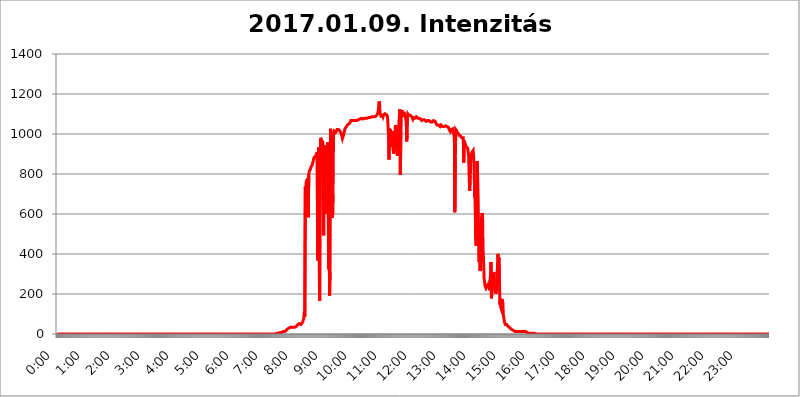
| Category | 2017.01.09. Intenzitás [W/m^2] |
|---|---|
| 0.0 | 0 |
| 0.0006944444444444445 | 0 |
| 0.001388888888888889 | 0 |
| 0.0020833333333333333 | 0 |
| 0.002777777777777778 | 0 |
| 0.003472222222222222 | 0 |
| 0.004166666666666667 | 0 |
| 0.004861111111111111 | 0 |
| 0.005555555555555556 | 0 |
| 0.0062499999999999995 | 0 |
| 0.006944444444444444 | 0 |
| 0.007638888888888889 | 0 |
| 0.008333333333333333 | 0 |
| 0.009027777777777779 | 0 |
| 0.009722222222222222 | 0 |
| 0.010416666666666666 | 0 |
| 0.011111111111111112 | 0 |
| 0.011805555555555555 | 0 |
| 0.012499999999999999 | 0 |
| 0.013194444444444444 | 0 |
| 0.013888888888888888 | 0 |
| 0.014583333333333332 | 0 |
| 0.015277777777777777 | 0 |
| 0.015972222222222224 | 0 |
| 0.016666666666666666 | 0 |
| 0.017361111111111112 | 0 |
| 0.018055555555555557 | 0 |
| 0.01875 | 0 |
| 0.019444444444444445 | 0 |
| 0.02013888888888889 | 0 |
| 0.020833333333333332 | 0 |
| 0.02152777777777778 | 0 |
| 0.022222222222222223 | 0 |
| 0.02291666666666667 | 0 |
| 0.02361111111111111 | 0 |
| 0.024305555555555556 | 0 |
| 0.024999999999999998 | 0 |
| 0.025694444444444447 | 0 |
| 0.02638888888888889 | 0 |
| 0.027083333333333334 | 0 |
| 0.027777777777777776 | 0 |
| 0.02847222222222222 | 0 |
| 0.029166666666666664 | 0 |
| 0.029861111111111113 | 0 |
| 0.030555555555555555 | 0 |
| 0.03125 | 0 |
| 0.03194444444444445 | 0 |
| 0.03263888888888889 | 0 |
| 0.03333333333333333 | 0 |
| 0.034027777777777775 | 0 |
| 0.034722222222222224 | 0 |
| 0.035416666666666666 | 0 |
| 0.036111111111111115 | 0 |
| 0.03680555555555556 | 0 |
| 0.0375 | 0 |
| 0.03819444444444444 | 0 |
| 0.03888888888888889 | 0 |
| 0.03958333333333333 | 0 |
| 0.04027777777777778 | 0 |
| 0.04097222222222222 | 0 |
| 0.041666666666666664 | 0 |
| 0.042361111111111106 | 0 |
| 0.04305555555555556 | 0 |
| 0.043750000000000004 | 0 |
| 0.044444444444444446 | 0 |
| 0.04513888888888889 | 0 |
| 0.04583333333333334 | 0 |
| 0.04652777777777778 | 0 |
| 0.04722222222222222 | 0 |
| 0.04791666666666666 | 0 |
| 0.04861111111111111 | 0 |
| 0.049305555555555554 | 0 |
| 0.049999999999999996 | 0 |
| 0.05069444444444445 | 0 |
| 0.051388888888888894 | 0 |
| 0.052083333333333336 | 0 |
| 0.05277777777777778 | 0 |
| 0.05347222222222222 | 0 |
| 0.05416666666666667 | 0 |
| 0.05486111111111111 | 0 |
| 0.05555555555555555 | 0 |
| 0.05625 | 0 |
| 0.05694444444444444 | 0 |
| 0.057638888888888885 | 0 |
| 0.05833333333333333 | 0 |
| 0.05902777777777778 | 0 |
| 0.059722222222222225 | 0 |
| 0.06041666666666667 | 0 |
| 0.061111111111111116 | 0 |
| 0.06180555555555556 | 0 |
| 0.0625 | 0 |
| 0.06319444444444444 | 0 |
| 0.06388888888888888 | 0 |
| 0.06458333333333334 | 0 |
| 0.06527777777777778 | 0 |
| 0.06597222222222222 | 0 |
| 0.06666666666666667 | 0 |
| 0.06736111111111111 | 0 |
| 0.06805555555555555 | 0 |
| 0.06874999999999999 | 0 |
| 0.06944444444444443 | 0 |
| 0.07013888888888889 | 0 |
| 0.07083333333333333 | 0 |
| 0.07152777777777779 | 0 |
| 0.07222222222222223 | 0 |
| 0.07291666666666667 | 0 |
| 0.07361111111111111 | 0 |
| 0.07430555555555556 | 0 |
| 0.075 | 0 |
| 0.07569444444444444 | 0 |
| 0.0763888888888889 | 0 |
| 0.07708333333333334 | 0 |
| 0.07777777777777778 | 0 |
| 0.07847222222222222 | 0 |
| 0.07916666666666666 | 0 |
| 0.0798611111111111 | 0 |
| 0.08055555555555556 | 0 |
| 0.08125 | 0 |
| 0.08194444444444444 | 0 |
| 0.08263888888888889 | 0 |
| 0.08333333333333333 | 0 |
| 0.08402777777777777 | 0 |
| 0.08472222222222221 | 0 |
| 0.08541666666666665 | 0 |
| 0.08611111111111112 | 0 |
| 0.08680555555555557 | 0 |
| 0.08750000000000001 | 0 |
| 0.08819444444444445 | 0 |
| 0.08888888888888889 | 0 |
| 0.08958333333333333 | 0 |
| 0.09027777777777778 | 0 |
| 0.09097222222222222 | 0 |
| 0.09166666666666667 | 0 |
| 0.09236111111111112 | 0 |
| 0.09305555555555556 | 0 |
| 0.09375 | 0 |
| 0.09444444444444444 | 0 |
| 0.09513888888888888 | 0 |
| 0.09583333333333333 | 0 |
| 0.09652777777777777 | 0 |
| 0.09722222222222222 | 0 |
| 0.09791666666666667 | 0 |
| 0.09861111111111111 | 0 |
| 0.09930555555555555 | 0 |
| 0.09999999999999999 | 0 |
| 0.10069444444444443 | 0 |
| 0.1013888888888889 | 0 |
| 0.10208333333333335 | 0 |
| 0.10277777777777779 | 0 |
| 0.10347222222222223 | 0 |
| 0.10416666666666667 | 0 |
| 0.10486111111111111 | 0 |
| 0.10555555555555556 | 0 |
| 0.10625 | 0 |
| 0.10694444444444444 | 0 |
| 0.1076388888888889 | 0 |
| 0.10833333333333334 | 0 |
| 0.10902777777777778 | 0 |
| 0.10972222222222222 | 0 |
| 0.1111111111111111 | 0 |
| 0.11180555555555556 | 0 |
| 0.11180555555555556 | 0 |
| 0.1125 | 0 |
| 0.11319444444444444 | 0 |
| 0.11388888888888889 | 0 |
| 0.11458333333333333 | 0 |
| 0.11527777777777777 | 0 |
| 0.11597222222222221 | 0 |
| 0.11666666666666665 | 0 |
| 0.1173611111111111 | 0 |
| 0.11805555555555557 | 0 |
| 0.11944444444444445 | 0 |
| 0.12013888888888889 | 0 |
| 0.12083333333333333 | 0 |
| 0.12152777777777778 | 0 |
| 0.12222222222222223 | 0 |
| 0.12291666666666667 | 0 |
| 0.12291666666666667 | 0 |
| 0.12361111111111112 | 0 |
| 0.12430555555555556 | 0 |
| 0.125 | 0 |
| 0.12569444444444444 | 0 |
| 0.12638888888888888 | 0 |
| 0.12708333333333333 | 0 |
| 0.16875 | 0 |
| 0.12847222222222224 | 0 |
| 0.12916666666666668 | 0 |
| 0.12986111111111112 | 0 |
| 0.13055555555555556 | 0 |
| 0.13125 | 0 |
| 0.13194444444444445 | 0 |
| 0.1326388888888889 | 0 |
| 0.13333333333333333 | 0 |
| 0.13402777777777777 | 0 |
| 0.13402777777777777 | 0 |
| 0.13472222222222222 | 0 |
| 0.13541666666666666 | 0 |
| 0.1361111111111111 | 0 |
| 0.13749999999999998 | 0 |
| 0.13819444444444443 | 0 |
| 0.1388888888888889 | 0 |
| 0.13958333333333334 | 0 |
| 0.14027777777777778 | 0 |
| 0.14097222222222222 | 0 |
| 0.14166666666666666 | 0 |
| 0.1423611111111111 | 0 |
| 0.14305555555555557 | 0 |
| 0.14375000000000002 | 0 |
| 0.14444444444444446 | 0 |
| 0.1451388888888889 | 0 |
| 0.1451388888888889 | 0 |
| 0.14652777777777778 | 0 |
| 0.14722222222222223 | 0 |
| 0.14791666666666667 | 0 |
| 0.1486111111111111 | 0 |
| 0.14930555555555555 | 0 |
| 0.15 | 0 |
| 0.15069444444444444 | 0 |
| 0.15138888888888888 | 0 |
| 0.15208333333333332 | 0 |
| 0.15277777777777776 | 0 |
| 0.15347222222222223 | 0 |
| 0.15416666666666667 | 0 |
| 0.15486111111111112 | 0 |
| 0.15555555555555556 | 0 |
| 0.15625 | 0 |
| 0.15694444444444444 | 0 |
| 0.15763888888888888 | 0 |
| 0.15833333333333333 | 0 |
| 0.15902777777777777 | 0 |
| 0.15972222222222224 | 0 |
| 0.16041666666666668 | 0 |
| 0.16111111111111112 | 0 |
| 0.16180555555555556 | 0 |
| 0.1625 | 0 |
| 0.16319444444444445 | 0 |
| 0.1638888888888889 | 0 |
| 0.16458333333333333 | 0 |
| 0.16527777777777777 | 0 |
| 0.16597222222222222 | 0 |
| 0.16666666666666666 | 0 |
| 0.1673611111111111 | 0 |
| 0.16805555555555554 | 0 |
| 0.16874999999999998 | 0 |
| 0.16944444444444443 | 0 |
| 0.17013888888888887 | 0 |
| 0.1708333333333333 | 0 |
| 0.17152777777777775 | 0 |
| 0.17222222222222225 | 0 |
| 0.1729166666666667 | 0 |
| 0.17361111111111113 | 0 |
| 0.17430555555555557 | 0 |
| 0.17500000000000002 | 0 |
| 0.17569444444444446 | 0 |
| 0.1763888888888889 | 0 |
| 0.17708333333333334 | 0 |
| 0.17777777777777778 | 0 |
| 0.17847222222222223 | 0 |
| 0.17916666666666667 | 0 |
| 0.1798611111111111 | 0 |
| 0.18055555555555555 | 0 |
| 0.18125 | 0 |
| 0.18194444444444444 | 0 |
| 0.1826388888888889 | 0 |
| 0.18333333333333335 | 0 |
| 0.1840277777777778 | 0 |
| 0.18472222222222223 | 0 |
| 0.18541666666666667 | 0 |
| 0.18611111111111112 | 0 |
| 0.18680555555555556 | 0 |
| 0.1875 | 0 |
| 0.18819444444444444 | 0 |
| 0.18888888888888888 | 0 |
| 0.18958333333333333 | 0 |
| 0.19027777777777777 | 0 |
| 0.1909722222222222 | 0 |
| 0.19166666666666665 | 0 |
| 0.19236111111111112 | 0 |
| 0.19305555555555554 | 0 |
| 0.19375 | 0 |
| 0.19444444444444445 | 0 |
| 0.1951388888888889 | 0 |
| 0.19583333333333333 | 0 |
| 0.19652777777777777 | 0 |
| 0.19722222222222222 | 0 |
| 0.19791666666666666 | 0 |
| 0.1986111111111111 | 0 |
| 0.19930555555555554 | 0 |
| 0.19999999999999998 | 0 |
| 0.20069444444444443 | 0 |
| 0.20138888888888887 | 0 |
| 0.2020833333333333 | 0 |
| 0.2027777777777778 | 0 |
| 0.2034722222222222 | 0 |
| 0.2041666666666667 | 0 |
| 0.20486111111111113 | 0 |
| 0.20555555555555557 | 0 |
| 0.20625000000000002 | 0 |
| 0.20694444444444446 | 0 |
| 0.2076388888888889 | 0 |
| 0.20833333333333334 | 0 |
| 0.20902777777777778 | 0 |
| 0.20972222222222223 | 0 |
| 0.21041666666666667 | 0 |
| 0.2111111111111111 | 0 |
| 0.21180555555555555 | 0 |
| 0.2125 | 0 |
| 0.21319444444444444 | 0 |
| 0.2138888888888889 | 0 |
| 0.21458333333333335 | 0 |
| 0.2152777777777778 | 0 |
| 0.21597222222222223 | 0 |
| 0.21666666666666667 | 0 |
| 0.21736111111111112 | 0 |
| 0.21805555555555556 | 0 |
| 0.21875 | 0 |
| 0.21944444444444444 | 0 |
| 0.22013888888888888 | 0 |
| 0.22083333333333333 | 0 |
| 0.22152777777777777 | 0 |
| 0.2222222222222222 | 0 |
| 0.22291666666666665 | 0 |
| 0.2236111111111111 | 0 |
| 0.22430555555555556 | 0 |
| 0.225 | 0 |
| 0.22569444444444445 | 0 |
| 0.2263888888888889 | 0 |
| 0.22708333333333333 | 0 |
| 0.22777777777777777 | 0 |
| 0.22847222222222222 | 0 |
| 0.22916666666666666 | 0 |
| 0.2298611111111111 | 0 |
| 0.23055555555555554 | 0 |
| 0.23124999999999998 | 0 |
| 0.23194444444444443 | 0 |
| 0.23263888888888887 | 0 |
| 0.2333333333333333 | 0 |
| 0.2340277777777778 | 0 |
| 0.2347222222222222 | 0 |
| 0.2354166666666667 | 0 |
| 0.23611111111111113 | 0 |
| 0.23680555555555557 | 0 |
| 0.23750000000000002 | 0 |
| 0.23819444444444446 | 0 |
| 0.2388888888888889 | 0 |
| 0.23958333333333334 | 0 |
| 0.24027777777777778 | 0 |
| 0.24097222222222223 | 0 |
| 0.24166666666666667 | 0 |
| 0.2423611111111111 | 0 |
| 0.24305555555555555 | 0 |
| 0.24375 | 0 |
| 0.24444444444444446 | 0 |
| 0.24513888888888888 | 0 |
| 0.24583333333333335 | 0 |
| 0.2465277777777778 | 0 |
| 0.24722222222222223 | 0 |
| 0.24791666666666667 | 0 |
| 0.24861111111111112 | 0 |
| 0.24930555555555556 | 0 |
| 0.25 | 0 |
| 0.25069444444444444 | 0 |
| 0.2513888888888889 | 0 |
| 0.2520833333333333 | 0 |
| 0.25277777777777777 | 0 |
| 0.2534722222222222 | 0 |
| 0.25416666666666665 | 0 |
| 0.2548611111111111 | 0 |
| 0.2555555555555556 | 0 |
| 0.25625000000000003 | 0 |
| 0.2569444444444445 | 0 |
| 0.2576388888888889 | 0 |
| 0.25833333333333336 | 0 |
| 0.2590277777777778 | 0 |
| 0.25972222222222224 | 0 |
| 0.2604166666666667 | 0 |
| 0.2611111111111111 | 0 |
| 0.26180555555555557 | 0 |
| 0.2625 | 0 |
| 0.26319444444444445 | 0 |
| 0.2638888888888889 | 0 |
| 0.26458333333333334 | 0 |
| 0.2652777777777778 | 0 |
| 0.2659722222222222 | 0 |
| 0.26666666666666666 | 0 |
| 0.2673611111111111 | 0 |
| 0.26805555555555555 | 0 |
| 0.26875 | 0 |
| 0.26944444444444443 | 0 |
| 0.2701388888888889 | 0 |
| 0.2708333333333333 | 0 |
| 0.27152777777777776 | 0 |
| 0.2722222222222222 | 0 |
| 0.27291666666666664 | 0 |
| 0.2736111111111111 | 0 |
| 0.2743055555555555 | 0 |
| 0.27499999999999997 | 0 |
| 0.27569444444444446 | 0 |
| 0.27638888888888885 | 0 |
| 0.27708333333333335 | 0 |
| 0.2777777777777778 | 0 |
| 0.27847222222222223 | 0 |
| 0.2791666666666667 | 0 |
| 0.2798611111111111 | 0 |
| 0.28055555555555556 | 0 |
| 0.28125 | 0 |
| 0.28194444444444444 | 0 |
| 0.2826388888888889 | 0 |
| 0.2833333333333333 | 0 |
| 0.28402777777777777 | 0 |
| 0.2847222222222222 | 0 |
| 0.28541666666666665 | 0 |
| 0.28611111111111115 | 0 |
| 0.28680555555555554 | 0 |
| 0.28750000000000003 | 0 |
| 0.2881944444444445 | 0 |
| 0.2888888888888889 | 0 |
| 0.28958333333333336 | 0 |
| 0.2902777777777778 | 0 |
| 0.29097222222222224 | 0 |
| 0.2916666666666667 | 0 |
| 0.2923611111111111 | 0 |
| 0.29305555555555557 | 0 |
| 0.29375 | 0 |
| 0.29444444444444445 | 0 |
| 0.2951388888888889 | 0 |
| 0.29583333333333334 | 0 |
| 0.2965277777777778 | 0 |
| 0.2972222222222222 | 0 |
| 0.29791666666666666 | 0 |
| 0.2986111111111111 | 0 |
| 0.29930555555555555 | 0 |
| 0.3 | 0 |
| 0.30069444444444443 | 0 |
| 0.3013888888888889 | 0 |
| 0.3020833333333333 | 0 |
| 0.30277777777777776 | 0 |
| 0.3034722222222222 | 0 |
| 0.30416666666666664 | 0 |
| 0.3048611111111111 | 0 |
| 0.3055555555555555 | 3.525 |
| 0.30624999999999997 | 0 |
| 0.3069444444444444 | 3.525 |
| 0.3076388888888889 | 3.525 |
| 0.30833333333333335 | 3.525 |
| 0.3090277777777778 | 3.525 |
| 0.30972222222222223 | 3.525 |
| 0.3104166666666667 | 3.525 |
| 0.3111111111111111 | 7.887 |
| 0.31180555555555556 | 7.887 |
| 0.3125 | 7.887 |
| 0.31319444444444444 | 12.257 |
| 0.3138888888888889 | 12.257 |
| 0.3145833333333333 | 7.887 |
| 0.31527777777777777 | 7.887 |
| 0.3159722222222222 | 7.887 |
| 0.31666666666666665 | 12.257 |
| 0.31736111111111115 | 12.257 |
| 0.31805555555555554 | 12.257 |
| 0.31875000000000003 | 12.257 |
| 0.3194444444444445 | 12.257 |
| 0.3201388888888889 | 16.636 |
| 0.32083333333333336 | 16.636 |
| 0.3215277777777778 | 21.024 |
| 0.32222222222222224 | 21.024 |
| 0.3229166666666667 | 25.419 |
| 0.3236111111111111 | 25.419 |
| 0.32430555555555557 | 25.419 |
| 0.325 | 29.823 |
| 0.32569444444444445 | 29.823 |
| 0.3263888888888889 | 34.234 |
| 0.32708333333333334 | 34.234 |
| 0.3277777777777778 | 34.234 |
| 0.3284722222222222 | 34.234 |
| 0.32916666666666666 | 34.234 |
| 0.3298611111111111 | 34.234 |
| 0.33055555555555555 | 34.234 |
| 0.33125 | 34.234 |
| 0.33194444444444443 | 34.234 |
| 0.3326388888888889 | 34.234 |
| 0.3333333333333333 | 34.234 |
| 0.3340277777777778 | 38.653 |
| 0.3347222222222222 | 38.653 |
| 0.3354166666666667 | 38.653 |
| 0.3361111111111111 | 43.079 |
| 0.3368055555555556 | 43.079 |
| 0.33749999999999997 | 47.511 |
| 0.33819444444444446 | 47.511 |
| 0.33888888888888885 | 47.511 |
| 0.33958333333333335 | 51.951 |
| 0.34027777777777773 | 51.951 |
| 0.34097222222222223 | 47.511 |
| 0.3416666666666666 | 47.511 |
| 0.3423611111111111 | 47.511 |
| 0.3430555555555555 | 51.951 |
| 0.34375 | 56.398 |
| 0.3444444444444445 | 56.398 |
| 0.3451388888888889 | 69.775 |
| 0.3458333333333334 | 78.722 |
| 0.34652777777777777 | 110.201 |
| 0.34722222222222227 | 87.692 |
| 0.34791666666666665 | 735.89 |
| 0.34861111111111115 | 699.717 |
| 0.34930555555555554 | 759.723 |
| 0.35000000000000003 | 771.559 |
| 0.3506944444444444 | 711.832 |
| 0.3513888888888889 | 779.42 |
| 0.3520833333333333 | 583.779 |
| 0.3527777777777778 | 798.974 |
| 0.3534722222222222 | 814.519 |
| 0.3541666666666667 | 818.392 |
| 0.3548611111111111 | 822.26 |
| 0.35555555555555557 | 829.981 |
| 0.35625 | 837.682 |
| 0.35694444444444445 | 841.526 |
| 0.3576388888888889 | 845.365 |
| 0.35833333333333334 | 856.855 |
| 0.3590277777777778 | 864.493 |
| 0.3597222222222222 | 875.918 |
| 0.36041666666666666 | 883.516 |
| 0.3611111111111111 | 887.309 |
| 0.36180555555555555 | 887.309 |
| 0.3625 | 887.309 |
| 0.36319444444444443 | 898.668 |
| 0.3638888888888889 | 883.516 |
| 0.3645833333333333 | 909.996 |
| 0.3652777777777778 | 369.23 |
| 0.3659722222222222 | 735.89 |
| 0.3666666666666667 | 932.576 |
| 0.3673611111111111 | 364.728 |
| 0.3680555555555556 | 164.605 |
| 0.36874999999999997 | 894.885 |
| 0.36944444444444446 | 981.244 |
| 0.37013888888888885 | 984.98 |
| 0.37083333333333335 | 977.508 |
| 0.37152777777777773 | 951.327 |
| 0.37222222222222223 | 966.295 |
| 0.3729166666666666 | 970.034 |
| 0.3736111111111111 | 493.475 |
| 0.3743055555555555 | 943.832 |
| 0.375 | 887.309 |
| 0.3756944444444445 | 600.661 |
| 0.3763888888888889 | 940.082 |
| 0.3770833333333334 | 917.534 |
| 0.37777777777777777 | 921.298 |
| 0.37847222222222227 | 928.819 |
| 0.37916666666666665 | 940.082 |
| 0.37986111111111115 | 958.814 |
| 0.38055555555555554 | 324.052 |
| 0.38125000000000003 | 703.762 |
| 0.3819444444444444 | 191.937 |
| 0.3826388888888889 | 310.44 |
| 0.3833333333333333 | 1026.06 |
| 0.3840277777777778 | 928.819 |
| 0.3847222222222222 | 1007.383 |
| 0.3854166666666667 | 1011.118 |
| 0.3861111111111111 | 579.542 |
| 0.38680555555555557 | 695.666 |
| 0.3875 | 1007.383 |
| 0.38819444444444445 | 1014.852 |
| 0.3888888888888889 | 1018.587 |
| 0.38958333333333334 | 1011.118 |
| 0.3902777777777778 | 1007.383 |
| 0.3909722222222222 | 1007.383 |
| 0.39166666666666666 | 1014.852 |
| 0.3923611111111111 | 1022.323 |
| 0.39305555555555555 | 1022.323 |
| 0.39375 | 1022.323 |
| 0.39444444444444443 | 1022.323 |
| 0.3951388888888889 | 1022.323 |
| 0.3958333333333333 | 1022.323 |
| 0.3965277777777778 | 1014.852 |
| 0.3972222222222222 | 1011.118 |
| 0.3979166666666667 | 1003.65 |
| 0.3986111111111111 | 996.182 |
| 0.3993055555555556 | 988.714 |
| 0.39999999999999997 | 977.508 |
| 0.40069444444444446 | 981.244 |
| 0.40138888888888885 | 992.448 |
| 0.40208333333333335 | 1003.65 |
| 0.40277777777777773 | 1014.852 |
| 0.40347222222222223 | 1026.06 |
| 0.4041666666666666 | 1029.798 |
| 0.4048611111111111 | 1033.537 |
| 0.4055555555555555 | 1033.537 |
| 0.40625 | 1041.019 |
| 0.4069444444444445 | 1044.762 |
| 0.4076388888888889 | 1048.508 |
| 0.4083333333333334 | 1052.255 |
| 0.40902777777777777 | 1052.255 |
| 0.40972222222222227 | 1052.255 |
| 0.41041666666666665 | 1052.255 |
| 0.41111111111111115 | 1059.756 |
| 0.41180555555555554 | 1067.267 |
| 0.41250000000000003 | 1071.027 |
| 0.4131944444444444 | 1067.267 |
| 0.4138888888888889 | 1067.267 |
| 0.4145833333333333 | 1067.267 |
| 0.4152777777777778 | 1067.267 |
| 0.4159722222222222 | 1067.267 |
| 0.4166666666666667 | 1063.51 |
| 0.4173611111111111 | 1067.267 |
| 0.41805555555555557 | 1067.267 |
| 0.41875 | 1067.267 |
| 0.41944444444444445 | 1071.027 |
| 0.4201388888888889 | 1067.267 |
| 0.42083333333333334 | 1071.027 |
| 0.4215277777777778 | 1067.267 |
| 0.4222222222222222 | 1071.027 |
| 0.42291666666666666 | 1074.789 |
| 0.4236111111111111 | 1074.789 |
| 0.42430555555555555 | 1074.789 |
| 0.425 | 1078.555 |
| 0.42569444444444443 | 1078.555 |
| 0.4263888888888889 | 1078.555 |
| 0.4270833333333333 | 1078.555 |
| 0.4277777777777778 | 1074.789 |
| 0.4284722222222222 | 1074.789 |
| 0.4291666666666667 | 1074.789 |
| 0.4298611111111111 | 1074.789 |
| 0.4305555555555556 | 1078.555 |
| 0.43124999999999997 | 1078.555 |
| 0.43194444444444446 | 1078.555 |
| 0.43263888888888885 | 1078.555 |
| 0.43333333333333335 | 1078.555 |
| 0.43402777777777773 | 1078.555 |
| 0.43472222222222223 | 1078.555 |
| 0.4354166666666666 | 1078.555 |
| 0.4361111111111111 | 1078.555 |
| 0.4368055555555555 | 1082.324 |
| 0.4375 | 1082.324 |
| 0.4381944444444445 | 1078.555 |
| 0.4388888888888889 | 1082.324 |
| 0.4395833333333334 | 1082.324 |
| 0.44027777777777777 | 1086.097 |
| 0.44097222222222227 | 1086.097 |
| 0.44166666666666665 | 1086.097 |
| 0.44236111111111115 | 1086.097 |
| 0.44305555555555554 | 1086.097 |
| 0.44375000000000003 | 1089.873 |
| 0.4444444444444444 | 1086.097 |
| 0.4451388888888889 | 1086.097 |
| 0.4458333333333333 | 1086.097 |
| 0.4465277777777778 | 1089.873 |
| 0.4472222222222222 | 1089.873 |
| 0.4479166666666667 | 1093.653 |
| 0.4486111111111111 | 1089.873 |
| 0.44930555555555557 | 1101.226 |
| 0.45 | 1112.618 |
| 0.45069444444444445 | 1131.708 |
| 0.4513888888888889 | 1162.571 |
| 0.45208333333333334 | 1147.086 |
| 0.4527777777777778 | 1105.019 |
| 0.4534722222222222 | 1097.437 |
| 0.45416666666666666 | 1089.873 |
| 0.4548611111111111 | 1093.653 |
| 0.45555555555555555 | 1089.873 |
| 0.45625 | 1093.653 |
| 0.45694444444444443 | 1086.097 |
| 0.4576388888888889 | 1093.653 |
| 0.4583333333333333 | 1089.873 |
| 0.4590277777777778 | 1093.653 |
| 0.4597222222222222 | 1101.226 |
| 0.4604166666666667 | 1101.226 |
| 0.4611111111111111 | 1101.226 |
| 0.4618055555555556 | 1097.437 |
| 0.46249999999999997 | 1097.437 |
| 0.46319444444444446 | 1086.097 |
| 0.46388888888888885 | 1044.762 |
| 0.46458333333333335 | 996.182 |
| 0.46527777777777773 | 872.114 |
| 0.46597222222222223 | 1026.06 |
| 0.4666666666666666 | 1014.852 |
| 0.4673611111111111 | 1022.323 |
| 0.4680555555555555 | 936.33 |
| 0.46875 | 1007.383 |
| 0.4694444444444445 | 984.98 |
| 0.4701388888888889 | 999.916 |
| 0.4708333333333334 | 1014.852 |
| 0.47152777777777777 | 902.447 |
| 0.47222222222222227 | 906.223 |
| 0.47291666666666665 | 928.819 |
| 0.47361111111111115 | 932.576 |
| 0.47430555555555554 | 1044.762 |
| 0.47500000000000003 | 1026.06 |
| 0.4756944444444444 | 958.814 |
| 0.4763888888888889 | 902.447 |
| 0.4770833333333333 | 891.099 |
| 0.4777777777777778 | 1007.383 |
| 0.4784722222222222 | 1014.852 |
| 0.4791666666666667 | 1011.118 |
| 0.4798611111111111 | 1089.873 |
| 0.48055555555555557 | 1124.056 |
| 0.48125 | 795.074 |
| 0.48194444444444445 | 1014.852 |
| 0.4826388888888889 | 1101.226 |
| 0.48333333333333334 | 1120.238 |
| 0.4840277777777778 | 1086.097 |
| 0.4847222222222222 | 1105.019 |
| 0.48541666666666666 | 1105.019 |
| 0.4861111111111111 | 1108.816 |
| 0.48680555555555555 | 1105.019 |
| 0.4875 | 1101.226 |
| 0.48819444444444443 | 1101.226 |
| 0.4888888888888889 | 1074.789 |
| 0.4895833333333333 | 1048.508 |
| 0.4902777777777778 | 962.555 |
| 0.4909722222222222 | 1086.097 |
| 0.4916666666666667 | 1101.226 |
| 0.4923611111111111 | 1097.437 |
| 0.4930555555555556 | 1093.653 |
| 0.49374999999999997 | 1093.653 |
| 0.49444444444444446 | 1089.873 |
| 0.49513888888888885 | 1093.653 |
| 0.49583333333333335 | 1089.873 |
| 0.49652777777777773 | 1093.653 |
| 0.49722222222222223 | 1086.097 |
| 0.4979166666666666 | 1086.097 |
| 0.4986111111111111 | 1074.789 |
| 0.4993055555555555 | 1082.324 |
| 0.5 | 1082.324 |
| 0.5006944444444444 | 1082.324 |
| 0.5013888888888889 | 1078.555 |
| 0.5020833333333333 | 1074.789 |
| 0.5027777777777778 | 1078.555 |
| 0.5034722222222222 | 1086.097 |
| 0.5041666666666667 | 1086.097 |
| 0.5048611111111111 | 1086.097 |
| 0.5055555555555555 | 1078.555 |
| 0.50625 | 1078.555 |
| 0.5069444444444444 | 1078.555 |
| 0.5076388888888889 | 1078.555 |
| 0.5083333333333333 | 1082.324 |
| 0.5090277777777777 | 1078.555 |
| 0.5097222222222222 | 1074.789 |
| 0.5104166666666666 | 1074.789 |
| 0.5111111111111112 | 1067.267 |
| 0.5118055555555555 | 1067.267 |
| 0.5125000000000001 | 1071.027 |
| 0.5131944444444444 | 1071.027 |
| 0.513888888888889 | 1074.789 |
| 0.5145833333333333 | 1074.789 |
| 0.5152777777777778 | 1071.027 |
| 0.5159722222222222 | 1067.267 |
| 0.5166666666666667 | 1067.267 |
| 0.517361111111111 | 1063.51 |
| 0.5180555555555556 | 1067.267 |
| 0.5187499999999999 | 1063.51 |
| 0.5194444444444445 | 1067.267 |
| 0.5201388888888888 | 1067.267 |
| 0.5208333333333334 | 1067.267 |
| 0.5215277777777778 | 1067.267 |
| 0.5222222222222223 | 1071.027 |
| 0.5229166666666667 | 1067.267 |
| 0.5236111111111111 | 1059.756 |
| 0.5243055555555556 | 1056.004 |
| 0.525 | 1059.756 |
| 0.5256944444444445 | 1059.756 |
| 0.5263888888888889 | 1063.51 |
| 0.5270833333333333 | 1063.51 |
| 0.5277777777777778 | 1067.267 |
| 0.5284722222222222 | 1067.267 |
| 0.5291666666666667 | 1063.51 |
| 0.5298611111111111 | 1063.51 |
| 0.5305555555555556 | 1063.51 |
| 0.53125 | 1052.255 |
| 0.5319444444444444 | 1048.508 |
| 0.5326388888888889 | 1044.762 |
| 0.5333333333333333 | 1044.762 |
| 0.5340277777777778 | 1044.762 |
| 0.5347222222222222 | 1044.762 |
| 0.5354166666666667 | 1041.019 |
| 0.5361111111111111 | 1041.019 |
| 0.5368055555555555 | 1037.277 |
| 0.5375 | 1041.019 |
| 0.5381944444444444 | 1044.762 |
| 0.5388888888888889 | 1041.019 |
| 0.5395833333333333 | 1041.019 |
| 0.5402777777777777 | 1037.277 |
| 0.5409722222222222 | 1041.019 |
| 0.5416666666666666 | 1041.019 |
| 0.5423611111111112 | 1037.277 |
| 0.5430555555555555 | 1041.019 |
| 0.5437500000000001 | 1041.019 |
| 0.5444444444444444 | 1041.019 |
| 0.545138888888889 | 1041.019 |
| 0.5458333333333333 | 1037.277 |
| 0.5465277777777778 | 1037.277 |
| 0.5472222222222222 | 1037.277 |
| 0.5479166666666667 | 1037.277 |
| 0.548611111111111 | 1033.537 |
| 0.5493055555555556 | 1029.798 |
| 0.5499999999999999 | 1018.587 |
| 0.5506944444444445 | 1014.852 |
| 0.5513888888888888 | 1011.118 |
| 0.5520833333333334 | 1014.852 |
| 0.5527777777777778 | 1022.323 |
| 0.5534722222222223 | 1018.587 |
| 0.5541666666666667 | 1022.323 |
| 0.5548611111111111 | 1026.06 |
| 0.5555555555555556 | 1026.06 |
| 0.55625 | 1022.323 |
| 0.5569444444444445 | 981.244 |
| 0.5576388888888889 | 609.062 |
| 0.5583333333333333 | 883.516 |
| 0.5590277777777778 | 1022.323 |
| 0.5597222222222222 | 1018.587 |
| 0.5604166666666667 | 1014.852 |
| 0.5611111111111111 | 1007.383 |
| 0.5618055555555556 | 1007.383 |
| 0.5625 | 1003.65 |
| 0.5631944444444444 | 999.916 |
| 0.5638888888888889 | 992.448 |
| 0.5645833333333333 | 988.714 |
| 0.5652777777777778 | 988.714 |
| 0.5659722222222222 | 988.714 |
| 0.5666666666666667 | 984.98 |
| 0.5673611111111111 | 981.244 |
| 0.5680555555555555 | 977.508 |
| 0.56875 | 977.508 |
| 0.5694444444444444 | 981.244 |
| 0.5701388888888889 | 856.855 |
| 0.5708333333333333 | 966.295 |
| 0.5715277777777777 | 955.071 |
| 0.5722222222222222 | 951.327 |
| 0.5729166666666666 | 943.832 |
| 0.5736111111111112 | 936.33 |
| 0.5743055555555555 | 932.576 |
| 0.5750000000000001 | 932.576 |
| 0.5756944444444444 | 928.819 |
| 0.576388888888889 | 928.819 |
| 0.5770833333333333 | 887.309 |
| 0.5777777777777778 | 779.42 |
| 0.5784722222222222 | 715.858 |
| 0.5791666666666667 | 791.169 |
| 0.579861111111111 | 826.123 |
| 0.5805555555555556 | 906.223 |
| 0.5812499999999999 | 898.668 |
| 0.5819444444444445 | 909.996 |
| 0.5826388888888888 | 913.766 |
| 0.5833333333333334 | 917.534 |
| 0.5840277777777778 | 887.309 |
| 0.5847222222222223 | 837.682 |
| 0.5854166666666667 | 683.473 |
| 0.5861111111111111 | 727.896 |
| 0.5868055555555556 | 484.735 |
| 0.5875 | 440.702 |
| 0.5881944444444445 | 541.121 |
| 0.5888888888888889 | 864.493 |
| 0.5895833333333333 | 802.868 |
| 0.5902777777777778 | 683.473 |
| 0.5909722222222222 | 493.475 |
| 0.5916666666666667 | 360.221 |
| 0.5923611111111111 | 489.108 |
| 0.5930555555555556 | 314.98 |
| 0.59375 | 333.113 |
| 0.5944444444444444 | 541.121 |
| 0.5951388888888889 | 583.779 |
| 0.5958333333333333 | 604.864 |
| 0.5965277777777778 | 592.233 |
| 0.5972222222222222 | 418.492 |
| 0.5979166666666667 | 373.729 |
| 0.5986111111111111 | 283.156 |
| 0.5993055555555555 | 260.373 |
| 0.6 | 242.127 |
| 0.6006944444444444 | 237.564 |
| 0.6013888888888889 | 228.436 |
| 0.6020833333333333 | 228.436 |
| 0.6027777777777777 | 233 |
| 0.6034722222222222 | 242.127 |
| 0.6041666666666666 | 233 |
| 0.6048611111111112 | 228.436 |
| 0.6055555555555555 | 255.813 |
| 0.6062500000000001 | 219.309 |
| 0.6069444444444444 | 269.49 |
| 0.607638888888889 | 292.259 |
| 0.6083333333333333 | 360.221 |
| 0.6090277777777778 | 178.264 |
| 0.6097222222222222 | 219.309 |
| 0.6104166666666667 | 305.898 |
| 0.611111111111111 | 260.373 |
| 0.6118055555555556 | 283.156 |
| 0.6124999999999999 | 310.44 |
| 0.6131944444444445 | 228.436 |
| 0.6138888888888888 | 233 |
| 0.6145833333333334 | 210.182 |
| 0.6152777777777778 | 201.058 |
| 0.6159722222222223 | 205.62 |
| 0.6166666666666667 | 233 |
| 0.6173611111111111 | 333.113 |
| 0.6180555555555556 | 400.638 |
| 0.61875 | 364.728 |
| 0.6194444444444445 | 382.715 |
| 0.6201388888888889 | 292.259 |
| 0.6208333333333333 | 146.423 |
| 0.6215277777777778 | 178.264 |
| 0.6222222222222222 | 132.814 |
| 0.6229166666666667 | 123.758 |
| 0.6236111111111111 | 132.814 |
| 0.6243055555555556 | 173.709 |
| 0.625 | 146.423 |
| 0.6256944444444444 | 96.682 |
| 0.6263888888888889 | 78.722 |
| 0.6270833333333333 | 60.85 |
| 0.6277777777777778 | 56.398 |
| 0.6284722222222222 | 47.511 |
| 0.6291666666666667 | 47.511 |
| 0.6298611111111111 | 47.511 |
| 0.6305555555555555 | 47.511 |
| 0.63125 | 43.079 |
| 0.6319444444444444 | 38.653 |
| 0.6326388888888889 | 38.653 |
| 0.6333333333333333 | 38.653 |
| 0.6340277777777777 | 34.234 |
| 0.6347222222222222 | 34.234 |
| 0.6354166666666666 | 29.823 |
| 0.6361111111111112 | 25.419 |
| 0.6368055555555555 | 25.419 |
| 0.6375000000000001 | 21.024 |
| 0.6381944444444444 | 21.024 |
| 0.638888888888889 | 21.024 |
| 0.6395833333333333 | 16.636 |
| 0.6402777777777778 | 16.636 |
| 0.6409722222222222 | 16.636 |
| 0.6416666666666667 | 12.257 |
| 0.642361111111111 | 12.257 |
| 0.6430555555555556 | 12.257 |
| 0.6437499999999999 | 12.257 |
| 0.6444444444444445 | 12.257 |
| 0.6451388888888888 | 12.257 |
| 0.6458333333333334 | 12.257 |
| 0.6465277777777778 | 12.257 |
| 0.6472222222222223 | 12.257 |
| 0.6479166666666667 | 12.257 |
| 0.6486111111111111 | 12.257 |
| 0.6493055555555556 | 12.257 |
| 0.65 | 12.257 |
| 0.6506944444444445 | 12.257 |
| 0.6513888888888889 | 12.257 |
| 0.6520833333333333 | 12.257 |
| 0.6527777777777778 | 12.257 |
| 0.6534722222222222 | 12.257 |
| 0.6541666666666667 | 12.257 |
| 0.6548611111111111 | 12.257 |
| 0.6555555555555556 | 12.257 |
| 0.65625 | 12.257 |
| 0.6569444444444444 | 12.257 |
| 0.6576388888888889 | 12.257 |
| 0.6583333333333333 | 7.887 |
| 0.6590277777777778 | 7.887 |
| 0.6597222222222222 | 7.887 |
| 0.6604166666666667 | 7.887 |
| 0.6611111111111111 | 3.525 |
| 0.6618055555555555 | 3.525 |
| 0.6625 | 3.525 |
| 0.6631944444444444 | 3.525 |
| 0.6638888888888889 | 3.525 |
| 0.6645833333333333 | 3.525 |
| 0.6652777777777777 | 3.525 |
| 0.6659722222222222 | 3.525 |
| 0.6666666666666666 | 3.525 |
| 0.6673611111111111 | 3.525 |
| 0.6680555555555556 | 3.525 |
| 0.6687500000000001 | 3.525 |
| 0.6694444444444444 | 3.525 |
| 0.6701388888888888 | 0 |
| 0.6708333333333334 | 0 |
| 0.6715277777777778 | 0 |
| 0.6722222222222222 | 0 |
| 0.6729166666666666 | 0 |
| 0.6736111111111112 | 0 |
| 0.6743055555555556 | 0 |
| 0.6749999999999999 | 0 |
| 0.6756944444444444 | 0 |
| 0.6763888888888889 | 0 |
| 0.6770833333333334 | 0 |
| 0.6777777777777777 | 0 |
| 0.6784722222222223 | 0 |
| 0.6791666666666667 | 0 |
| 0.6798611111111111 | 0 |
| 0.6805555555555555 | 0 |
| 0.68125 | 0 |
| 0.6819444444444445 | 0 |
| 0.6826388888888889 | 0 |
| 0.6833333333333332 | 0 |
| 0.6840277777777778 | 0 |
| 0.6847222222222222 | 0 |
| 0.6854166666666667 | 0 |
| 0.686111111111111 | 0 |
| 0.6868055555555556 | 0 |
| 0.6875 | 0 |
| 0.6881944444444444 | 0 |
| 0.688888888888889 | 0 |
| 0.6895833333333333 | 0 |
| 0.6902777777777778 | 0 |
| 0.6909722222222222 | 0 |
| 0.6916666666666668 | 0 |
| 0.6923611111111111 | 0 |
| 0.6930555555555555 | 0 |
| 0.69375 | 0 |
| 0.6944444444444445 | 0 |
| 0.6951388888888889 | 0 |
| 0.6958333333333333 | 0 |
| 0.6965277777777777 | 0 |
| 0.6972222222222223 | 0 |
| 0.6979166666666666 | 0 |
| 0.6986111111111111 | 0 |
| 0.6993055555555556 | 0 |
| 0.7000000000000001 | 0 |
| 0.7006944444444444 | 0 |
| 0.7013888888888888 | 0 |
| 0.7020833333333334 | 0 |
| 0.7027777777777778 | 0 |
| 0.7034722222222222 | 0 |
| 0.7041666666666666 | 0 |
| 0.7048611111111112 | 0 |
| 0.7055555555555556 | 0 |
| 0.7062499999999999 | 0 |
| 0.7069444444444444 | 0 |
| 0.7076388888888889 | 0 |
| 0.7083333333333334 | 0 |
| 0.7090277777777777 | 0 |
| 0.7097222222222223 | 0 |
| 0.7104166666666667 | 0 |
| 0.7111111111111111 | 0 |
| 0.7118055555555555 | 0 |
| 0.7125 | 0 |
| 0.7131944444444445 | 0 |
| 0.7138888888888889 | 0 |
| 0.7145833333333332 | 0 |
| 0.7152777777777778 | 0 |
| 0.7159722222222222 | 0 |
| 0.7166666666666667 | 0 |
| 0.717361111111111 | 0 |
| 0.7180555555555556 | 0 |
| 0.71875 | 0 |
| 0.7194444444444444 | 0 |
| 0.720138888888889 | 0 |
| 0.7208333333333333 | 0 |
| 0.7215277777777778 | 0 |
| 0.7222222222222222 | 0 |
| 0.7229166666666668 | 0 |
| 0.7236111111111111 | 0 |
| 0.7243055555555555 | 0 |
| 0.725 | 0 |
| 0.7256944444444445 | 0 |
| 0.7263888888888889 | 0 |
| 0.7270833333333333 | 0 |
| 0.7277777777777777 | 0 |
| 0.7284722222222223 | 0 |
| 0.7291666666666666 | 0 |
| 0.7298611111111111 | 0 |
| 0.7305555555555556 | 0 |
| 0.7312500000000001 | 0 |
| 0.7319444444444444 | 0 |
| 0.7326388888888888 | 0 |
| 0.7333333333333334 | 0 |
| 0.7340277777777778 | 0 |
| 0.7347222222222222 | 0 |
| 0.7354166666666666 | 0 |
| 0.7361111111111112 | 0 |
| 0.7368055555555556 | 0 |
| 0.7374999999999999 | 0 |
| 0.7381944444444444 | 0 |
| 0.7388888888888889 | 0 |
| 0.7395833333333334 | 0 |
| 0.7402777777777777 | 0 |
| 0.7409722222222223 | 0 |
| 0.7416666666666667 | 0 |
| 0.7423611111111111 | 0 |
| 0.7430555555555555 | 0 |
| 0.74375 | 0 |
| 0.7444444444444445 | 0 |
| 0.7451388888888889 | 0 |
| 0.7458333333333332 | 0 |
| 0.7465277777777778 | 0 |
| 0.7472222222222222 | 0 |
| 0.7479166666666667 | 0 |
| 0.748611111111111 | 0 |
| 0.7493055555555556 | 0 |
| 0.75 | 0 |
| 0.7506944444444444 | 0 |
| 0.751388888888889 | 0 |
| 0.7520833333333333 | 0 |
| 0.7527777777777778 | 0 |
| 0.7534722222222222 | 0 |
| 0.7541666666666668 | 0 |
| 0.7548611111111111 | 0 |
| 0.7555555555555555 | 0 |
| 0.75625 | 0 |
| 0.7569444444444445 | 0 |
| 0.7576388888888889 | 0 |
| 0.7583333333333333 | 0 |
| 0.7590277777777777 | 0 |
| 0.7597222222222223 | 0 |
| 0.7604166666666666 | 0 |
| 0.7611111111111111 | 0 |
| 0.7618055555555556 | 0 |
| 0.7625000000000001 | 0 |
| 0.7631944444444444 | 0 |
| 0.7638888888888888 | 0 |
| 0.7645833333333334 | 0 |
| 0.7652777777777778 | 0 |
| 0.7659722222222222 | 0 |
| 0.7666666666666666 | 0 |
| 0.7673611111111112 | 0 |
| 0.7680555555555556 | 0 |
| 0.7687499999999999 | 0 |
| 0.7694444444444444 | 0 |
| 0.7701388888888889 | 0 |
| 0.7708333333333334 | 0 |
| 0.7715277777777777 | 0 |
| 0.7722222222222223 | 0 |
| 0.7729166666666667 | 0 |
| 0.7736111111111111 | 0 |
| 0.7743055555555555 | 0 |
| 0.775 | 0 |
| 0.7756944444444445 | 0 |
| 0.7763888888888889 | 0 |
| 0.7770833333333332 | 0 |
| 0.7777777777777778 | 0 |
| 0.7784722222222222 | 0 |
| 0.7791666666666667 | 0 |
| 0.779861111111111 | 0 |
| 0.7805555555555556 | 0 |
| 0.78125 | 0 |
| 0.7819444444444444 | 0 |
| 0.782638888888889 | 0 |
| 0.7833333333333333 | 0 |
| 0.7840277777777778 | 0 |
| 0.7847222222222222 | 0 |
| 0.7854166666666668 | 0 |
| 0.7861111111111111 | 0 |
| 0.7868055555555555 | 0 |
| 0.7875 | 0 |
| 0.7881944444444445 | 0 |
| 0.7888888888888889 | 0 |
| 0.7895833333333333 | 0 |
| 0.7902777777777777 | 0 |
| 0.7909722222222223 | 0 |
| 0.7916666666666666 | 0 |
| 0.7923611111111111 | 0 |
| 0.7930555555555556 | 0 |
| 0.7937500000000001 | 0 |
| 0.7944444444444444 | 0 |
| 0.7951388888888888 | 0 |
| 0.7958333333333334 | 0 |
| 0.7965277777777778 | 0 |
| 0.7972222222222222 | 0 |
| 0.7979166666666666 | 0 |
| 0.7986111111111112 | 0 |
| 0.7993055555555556 | 0 |
| 0.7999999999999999 | 0 |
| 0.8006944444444444 | 0 |
| 0.8013888888888889 | 0 |
| 0.8020833333333334 | 0 |
| 0.8027777777777777 | 0 |
| 0.8034722222222223 | 0 |
| 0.8041666666666667 | 0 |
| 0.8048611111111111 | 0 |
| 0.8055555555555555 | 0 |
| 0.80625 | 0 |
| 0.8069444444444445 | 0 |
| 0.8076388888888889 | 0 |
| 0.8083333333333332 | 0 |
| 0.8090277777777778 | 0 |
| 0.8097222222222222 | 0 |
| 0.8104166666666667 | 0 |
| 0.811111111111111 | 0 |
| 0.8118055555555556 | 0 |
| 0.8125 | 0 |
| 0.8131944444444444 | 0 |
| 0.813888888888889 | 0 |
| 0.8145833333333333 | 0 |
| 0.8152777777777778 | 0 |
| 0.8159722222222222 | 0 |
| 0.8166666666666668 | 0 |
| 0.8173611111111111 | 0 |
| 0.8180555555555555 | 0 |
| 0.81875 | 0 |
| 0.8194444444444445 | 0 |
| 0.8201388888888889 | 0 |
| 0.8208333333333333 | 0 |
| 0.8215277777777777 | 0 |
| 0.8222222222222223 | 0 |
| 0.8229166666666666 | 0 |
| 0.8236111111111111 | 0 |
| 0.8243055555555556 | 0 |
| 0.8250000000000001 | 0 |
| 0.8256944444444444 | 0 |
| 0.8263888888888888 | 0 |
| 0.8270833333333334 | 0 |
| 0.8277777777777778 | 0 |
| 0.8284722222222222 | 0 |
| 0.8291666666666666 | 0 |
| 0.8298611111111112 | 0 |
| 0.8305555555555556 | 0 |
| 0.8312499999999999 | 0 |
| 0.8319444444444444 | 0 |
| 0.8326388888888889 | 0 |
| 0.8333333333333334 | 0 |
| 0.8340277777777777 | 0 |
| 0.8347222222222223 | 0 |
| 0.8354166666666667 | 0 |
| 0.8361111111111111 | 0 |
| 0.8368055555555555 | 0 |
| 0.8375 | 0 |
| 0.8381944444444445 | 0 |
| 0.8388888888888889 | 0 |
| 0.8395833333333332 | 0 |
| 0.8402777777777778 | 0 |
| 0.8409722222222222 | 0 |
| 0.8416666666666667 | 0 |
| 0.842361111111111 | 0 |
| 0.8430555555555556 | 0 |
| 0.84375 | 0 |
| 0.8444444444444444 | 0 |
| 0.845138888888889 | 0 |
| 0.8458333333333333 | 0 |
| 0.8465277777777778 | 0 |
| 0.8472222222222222 | 0 |
| 0.8479166666666668 | 0 |
| 0.8486111111111111 | 0 |
| 0.8493055555555555 | 0 |
| 0.85 | 0 |
| 0.8506944444444445 | 0 |
| 0.8513888888888889 | 0 |
| 0.8520833333333333 | 0 |
| 0.8527777777777777 | 0 |
| 0.8534722222222223 | 0 |
| 0.8541666666666666 | 0 |
| 0.8548611111111111 | 0 |
| 0.8555555555555556 | 0 |
| 0.8562500000000001 | 0 |
| 0.8569444444444444 | 0 |
| 0.8576388888888888 | 0 |
| 0.8583333333333334 | 0 |
| 0.8590277777777778 | 0 |
| 0.8597222222222222 | 0 |
| 0.8604166666666666 | 0 |
| 0.8611111111111112 | 0 |
| 0.8618055555555556 | 0 |
| 0.8624999999999999 | 0 |
| 0.8631944444444444 | 0 |
| 0.8638888888888889 | 0 |
| 0.8645833333333334 | 0 |
| 0.8652777777777777 | 0 |
| 0.8659722222222223 | 0 |
| 0.8666666666666667 | 0 |
| 0.8673611111111111 | 0 |
| 0.8680555555555555 | 0 |
| 0.86875 | 0 |
| 0.8694444444444445 | 0 |
| 0.8701388888888889 | 0 |
| 0.8708333333333332 | 0 |
| 0.8715277777777778 | 0 |
| 0.8722222222222222 | 0 |
| 0.8729166666666667 | 0 |
| 0.873611111111111 | 0 |
| 0.8743055555555556 | 0 |
| 0.875 | 0 |
| 0.8756944444444444 | 0 |
| 0.876388888888889 | 0 |
| 0.8770833333333333 | 0 |
| 0.8777777777777778 | 0 |
| 0.8784722222222222 | 0 |
| 0.8791666666666668 | 0 |
| 0.8798611111111111 | 0 |
| 0.8805555555555555 | 0 |
| 0.88125 | 0 |
| 0.8819444444444445 | 0 |
| 0.8826388888888889 | 0 |
| 0.8833333333333333 | 0 |
| 0.8840277777777777 | 0 |
| 0.8847222222222223 | 0 |
| 0.8854166666666666 | 0 |
| 0.8861111111111111 | 0 |
| 0.8868055555555556 | 0 |
| 0.8875000000000001 | 0 |
| 0.8881944444444444 | 0 |
| 0.8888888888888888 | 0 |
| 0.8895833333333334 | 0 |
| 0.8902777777777778 | 0 |
| 0.8909722222222222 | 0 |
| 0.8916666666666666 | 0 |
| 0.8923611111111112 | 0 |
| 0.8930555555555556 | 0 |
| 0.8937499999999999 | 0 |
| 0.8944444444444444 | 0 |
| 0.8951388888888889 | 0 |
| 0.8958333333333334 | 0 |
| 0.8965277777777777 | 0 |
| 0.8972222222222223 | 0 |
| 0.8979166666666667 | 0 |
| 0.8986111111111111 | 0 |
| 0.8993055555555555 | 0 |
| 0.9 | 0 |
| 0.9006944444444445 | 0 |
| 0.9013888888888889 | 0 |
| 0.9020833333333332 | 0 |
| 0.9027777777777778 | 0 |
| 0.9034722222222222 | 0 |
| 0.9041666666666667 | 0 |
| 0.904861111111111 | 0 |
| 0.9055555555555556 | 0 |
| 0.90625 | 0 |
| 0.9069444444444444 | 0 |
| 0.907638888888889 | 0 |
| 0.9083333333333333 | 0 |
| 0.9090277777777778 | 0 |
| 0.9097222222222222 | 0 |
| 0.9104166666666668 | 0 |
| 0.9111111111111111 | 0 |
| 0.9118055555555555 | 0 |
| 0.9125 | 0 |
| 0.9131944444444445 | 0 |
| 0.9138888888888889 | 0 |
| 0.9145833333333333 | 0 |
| 0.9152777777777777 | 0 |
| 0.9159722222222223 | 0 |
| 0.9166666666666666 | 0 |
| 0.9173611111111111 | 0 |
| 0.9180555555555556 | 0 |
| 0.9187500000000001 | 0 |
| 0.9194444444444444 | 0 |
| 0.9201388888888888 | 0 |
| 0.9208333333333334 | 0 |
| 0.9215277777777778 | 0 |
| 0.9222222222222222 | 0 |
| 0.9229166666666666 | 0 |
| 0.9236111111111112 | 0 |
| 0.9243055555555556 | 0 |
| 0.9249999999999999 | 0 |
| 0.9256944444444444 | 0 |
| 0.9263888888888889 | 0 |
| 0.9270833333333334 | 0 |
| 0.9277777777777777 | 0 |
| 0.9284722222222223 | 0 |
| 0.9291666666666667 | 0 |
| 0.9298611111111111 | 0 |
| 0.9305555555555555 | 0 |
| 0.93125 | 0 |
| 0.9319444444444445 | 0 |
| 0.9326388888888889 | 0 |
| 0.9333333333333332 | 0 |
| 0.9340277777777778 | 0 |
| 0.9347222222222222 | 0 |
| 0.9354166666666667 | 0 |
| 0.936111111111111 | 0 |
| 0.9368055555555556 | 0 |
| 0.9375 | 0 |
| 0.9381944444444444 | 0 |
| 0.938888888888889 | 0 |
| 0.9395833333333333 | 0 |
| 0.9402777777777778 | 0 |
| 0.9409722222222222 | 0 |
| 0.9416666666666668 | 0 |
| 0.9423611111111111 | 0 |
| 0.9430555555555555 | 0 |
| 0.94375 | 0 |
| 0.9444444444444445 | 0 |
| 0.9451388888888889 | 0 |
| 0.9458333333333333 | 0 |
| 0.9465277777777777 | 0 |
| 0.9472222222222223 | 0 |
| 0.9479166666666666 | 0 |
| 0.9486111111111111 | 0 |
| 0.9493055555555556 | 0 |
| 0.9500000000000001 | 0 |
| 0.9506944444444444 | 0 |
| 0.9513888888888888 | 0 |
| 0.9520833333333334 | 0 |
| 0.9527777777777778 | 0 |
| 0.9534722222222222 | 0 |
| 0.9541666666666666 | 0 |
| 0.9548611111111112 | 0 |
| 0.9555555555555556 | 0 |
| 0.9562499999999999 | 0 |
| 0.9569444444444444 | 0 |
| 0.9576388888888889 | 0 |
| 0.9583333333333334 | 0 |
| 0.9590277777777777 | 0 |
| 0.9597222222222223 | 0 |
| 0.9604166666666667 | 0 |
| 0.9611111111111111 | 0 |
| 0.9618055555555555 | 0 |
| 0.9625 | 0 |
| 0.9631944444444445 | 0 |
| 0.9638888888888889 | 0 |
| 0.9645833333333332 | 0 |
| 0.9652777777777778 | 0 |
| 0.9659722222222222 | 0 |
| 0.9666666666666667 | 0 |
| 0.967361111111111 | 0 |
| 0.9680555555555556 | 0 |
| 0.96875 | 0 |
| 0.9694444444444444 | 0 |
| 0.970138888888889 | 0 |
| 0.9708333333333333 | 0 |
| 0.9715277777777778 | 0 |
| 0.9722222222222222 | 0 |
| 0.9729166666666668 | 0 |
| 0.9736111111111111 | 0 |
| 0.9743055555555555 | 0 |
| 0.975 | 0 |
| 0.9756944444444445 | 0 |
| 0.9763888888888889 | 0 |
| 0.9770833333333333 | 0 |
| 0.9777777777777777 | 0 |
| 0.9784722222222223 | 0 |
| 0.9791666666666666 | 0 |
| 0.9798611111111111 | 0 |
| 0.9805555555555556 | 0 |
| 0.9812500000000001 | 0 |
| 0.9819444444444444 | 0 |
| 0.9826388888888888 | 0 |
| 0.9833333333333334 | 0 |
| 0.9840277777777778 | 0 |
| 0.9847222222222222 | 0 |
| 0.9854166666666666 | 0 |
| 0.9861111111111112 | 0 |
| 0.9868055555555556 | 0 |
| 0.9874999999999999 | 0 |
| 0.9881944444444444 | 0 |
| 0.9888888888888889 | 0 |
| 0.9895833333333334 | 0 |
| 0.9902777777777777 | 0 |
| 0.9909722222222223 | 0 |
| 0.9916666666666667 | 0 |
| 0.9923611111111111 | 0 |
| 0.9930555555555555 | 0 |
| 0.99375 | 0 |
| 0.9944444444444445 | 0 |
| 0.9951388888888889 | 0 |
| 0.9958333333333332 | 0 |
| 0.9965277777777778 | 0 |
| 0.9972222222222222 | 0 |
| 0.9979166666666667 | 0 |
| 0.998611111111111 | 0 |
| 0.9993055555555556 | 0 |